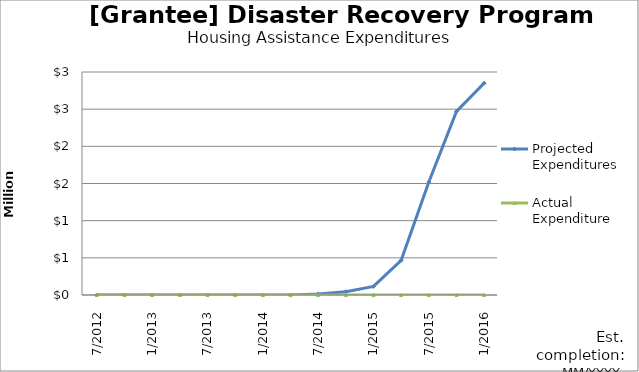
| Category | Projected Expenditures | Actual Expenditure |
|---|---|---|
| 7/2012 | 0 | 0 |
| 10/2012 | 0 | 0 |
| 1/2013 | 0 | 0 |
| 4/2013 | 0 | 0 |
| 7/2013 | 0 | 0 |
| 10/2013 | 0 | 0 |
| 1/2014 | 0 | 0 |
| 4/2014 | 0 | 0 |
| 7/2014 | 14000 | 0 |
| 10/2014 | 45000 | 0 |
| 1/2015 | 115000 | 0 |
| 4/2015 | 467000 | 0 |
| 7/2015 | 1520000 | 0 |
| 10/2015 | 2470000 | 0 |
| 1/2016 | 2850000 | 0 |